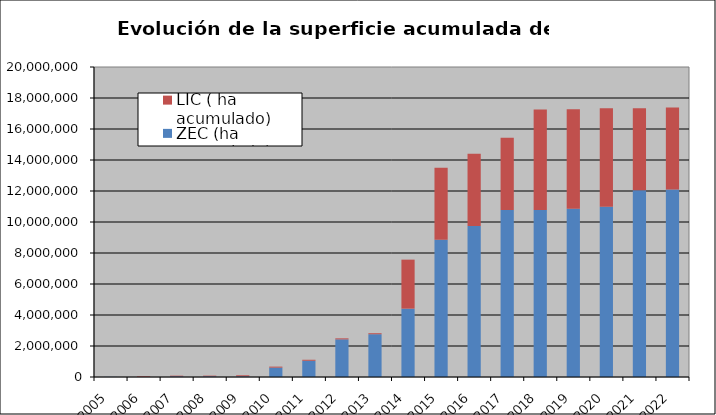
| Category | ZEC (ha acumulado) | LIC ( ha acumulado) |
|---|---|---|
| 2005 | 9028.693 | 0 |
| 2006 | 10757.311 | 41727.101 |
| 2007 | 43949.619 | 41727.101 |
| 2008 | 46001.94 | 41727.101 |
| 2009 | 46001.94 | 64627.616 |
| 2010 | 604736.967 | 64627.616 |
| 2011 | 1047579.74 | 64627.616 |
| 2012 | 2428395.999 | 64627.616 |
| 2013 | 2759830.234 | 64663.537 |
| 2014 | 4409629.641 | 3161634.461 |
| 2015 | 8859983.908 | 4646473.438 |
| 2016 | 9748019.019 | 4651466.288 |
| 2017 | 10780801.926 | 4651466.288 |
| 2018 | 10780801.926 | 6481294.651 |
| 2019 | 10847236.568 | 6422003.822 |
| 2020 | 10980001.51 | 6358755.143 |
| 2021 | 12052490.102 | 5291068.277 |
| 2022 | 12093218.358 | 5291497.491 |